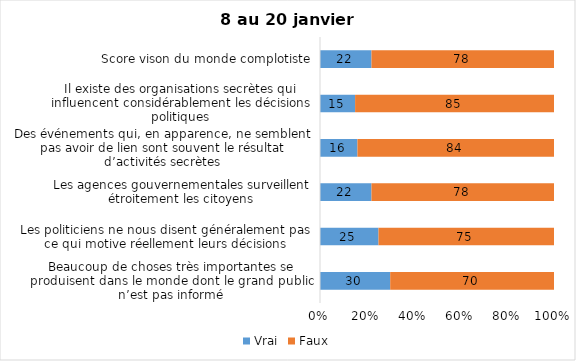
| Category | Vrai | Faux |
|---|---|---|
| Beaucoup de choses très importantes se produisent dans le monde dont le grand public n’est pas informé | 30 | 70 |
| Les politiciens ne nous disent généralement pas ce qui motive réellement leurs décisions | 25 | 75 |
| Les agences gouvernementales surveillent étroitement les citoyens | 22 | 78 |
| Des événements qui, en apparence, ne semblent pas avoir de lien sont souvent le résultat d’activités secrètes | 16 | 84 |
| Il existe des organisations secrètes qui influencent considérablement les décisions politiques | 15 | 85 |
| Score vison du monde complotiste | 22 | 78 |